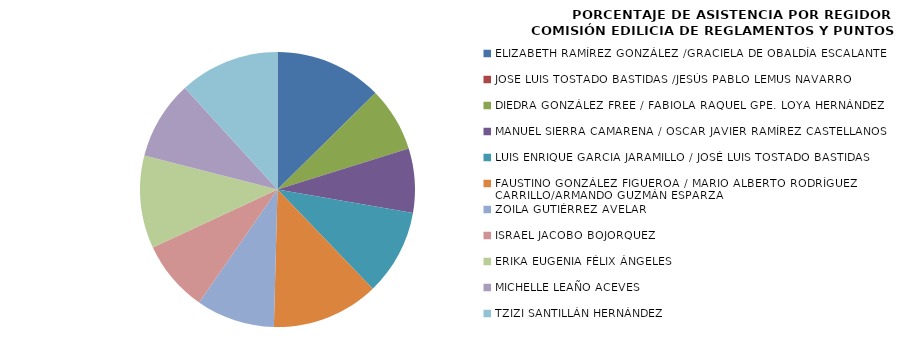
| Category | Series 0 |
|---|---|
| ELIZABETH RAMÍREZ GONZÁLEZ /GRACIELA DE OBALDÍA ESCALANTE | 15 |
| JOSE LUIS TOSTADO BASTIDAS /JESÚS PABLO LEMUS NAVARRO | 0 |
| DIEDRA GONZÁLEZ FREE / FABIOLA RAQUEL GPE. LOYA HERNÁNDEZ | 9 |
| MANUEL SIERRA CAMARENA / OSCAR JAVIER RAMÍREZ CASTELLANOS | 9 |
| LUIS ENRIQUE GARCIA JARAMILLO / JOSÉ LUIS TOSTADO BASTIDAS | 12 |
| FAUSTINO GONZÁLEZ FIGUEROA / MARIO ALBERTO RODRÍGUEZ CARRILLO/ARMANDO GUZMÁN ESPARZA | 15 |
| ZOILA GUTIÉRREZ AVELAR | 11 |
| ISRAEL JACOBO BOJORQUEZ | 10 |
| ERIKA EUGENIA FÉLIX ÁNGELES | 13 |
| MICHELLE LEAÑO ACEVES | 11 |
| TZIZI SANTILLÁN HERNÁNDEZ | 14 |